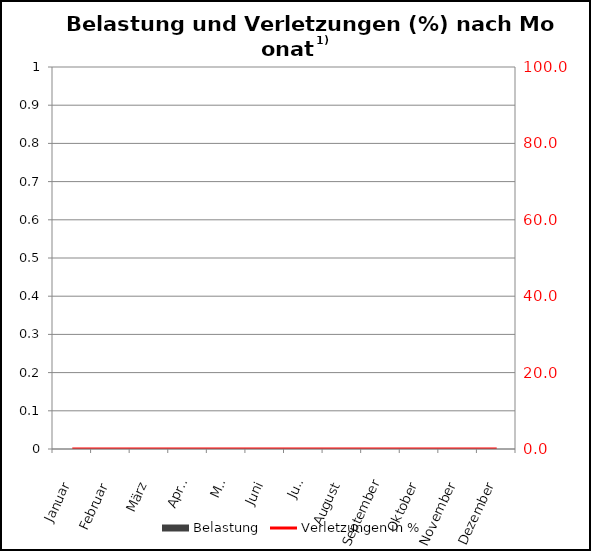
| Category | Belastung |
|---|---|
| Januar | 0 |
| Februar | 0 |
| März | 0 |
| April | 0 |
| Mai | 0 |
| Juni | 0 |
| Juli | 0 |
| August | 0 |
| September | 0 |
| Oktober | 0 |
| November | 0 |
| Dezember | 0 |